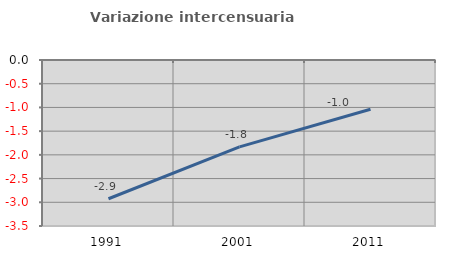
| Category | Variazione intercensuaria annua |
|---|---|
| 1991.0 | -2.925 |
| 2001.0 | -1.831 |
| 2011.0 | -1.037 |